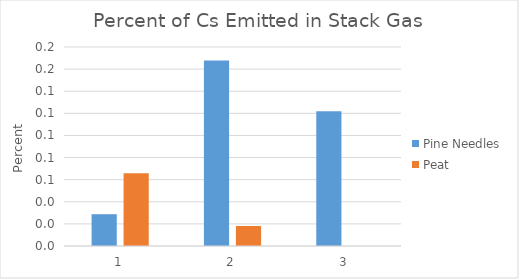
| Category | Pine Needles | Peat |
|---|---|---|
| 0 | 0.029 | 0.066 |
| 1 | 0.168 | 0.018 |
| 2 | 0.122 | 0 |